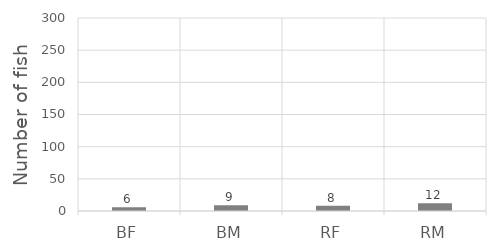
| Category | Series 0 |
|---|---|
| BF | 6 |
| BM | 9 |
| RF | 8 |
| RM | 12 |